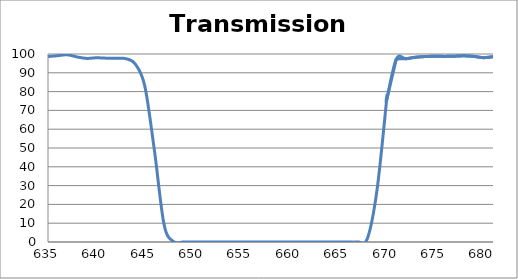
| Category | Transmission (%) |
|---|---|
| 2600.0 | 76.495 |
| 2599.0 | 76.409 |
| 2598.0 | 76.32 |
| 2597.0 | 76.13 |
| 2596.0 | 75.853 |
| 2595.0 | 75.54 |
| 2594.0 | 75.215 |
| 2593.0 | 74.875 |
| 2592.0 | 74.459 |
| 2591.0 | 74.133 |
| 2590.0 | 73.738 |
| 2589.0 | 73.397 |
| 2588.0 | 73.108 |
| 2587.0 | 72.826 |
| 2586.0 | 72.492 |
| 2585.0 | 72.167 |
| 2584.0 | 71.843 |
| 2583.0 | 71.6 |
| 2582.0 | 71.38 |
| 2581.0 | 71.221 |
| 2580.0 | 71.106 |
| 2579.0 | 71.011 |
| 2578.0 | 70.978 |
| 2577.0 | 70.971 |
| 2576.0 | 70.971 |
| 2575.0 | 71.068 |
| 2574.0 | 71.209 |
| 2573.0 | 71.421 |
| 2572.0 | 71.724 |
| 2571.0 | 72.112 |
| 2570.0 | 72.565 |
| 2569.0 | 73.155 |
| 2568.0 | 73.689 |
| 2567.0 | 74.33 |
| 2566.0 | 74.969 |
| 2565.0 | 75.629 |
| 2564.0 | 76.266 |
| 2563.0 | 76.9 |
| 2562.0 | 77.528 |
| 2561.0 | 78.076 |
| 2560.0 | 78.592 |
| 2559.0 | 79.073 |
| 2558.0 | 79.54 |
| 2557.0 | 79.952 |
| 2556.0 | 80.332 |
| 2555.0 | 80.634 |
| 2554.0 | 80.89 |
| 2553.0 | 81.133 |
| 2552.0 | 81.311 |
| 2551.0 | 81.387 |
| 2550.0 | 81.414 |
| 2549.0 | 81.342 |
| 2548.0 | 81.162 |
| 2547.0 | 80.871 |
| 2546.0 | 80.526 |
| 2545.0 | 80.151 |
| 2544.0 | 79.684 |
| 2543.0 | 79.217 |
| 2542.0 | 78.659 |
| 2541.0 | 78.131 |
| 2540.0 | 77.584 |
| 2539.0 | 76.984 |
| 2538.0 | 76.328 |
| 2537.0 | 75.659 |
| 2536.0 | 75.042 |
| 2535.0 | 74.496 |
| 2534.0 | 73.933 |
| 2533.0 | 73.467 |
| 2532.0 | 73.031 |
| 2531.0 | 72.627 |
| 2530.0 | 72.244 |
| 2529.0 | 72.003 |
| 2528.0 | 71.897 |
| 2527.0 | 71.824 |
| 2526.0 | 71.833 |
| 2525.0 | 71.914 |
| 2524.0 | 72.063 |
| 2523.0 | 72.305 |
| 2522.0 | 72.639 |
| 2521.0 | 73.029 |
| 2520.0 | 73.538 |
| 2519.0 | 74.135 |
| 2518.0 | 74.8 |
| 2517.0 | 75.566 |
| 2516.0 | 76.387 |
| 2515.0 | 77.208 |
| 2514.0 | 78.04 |
| 2513.0 | 78.874 |
| 2512.0 | 79.705 |
| 2511.0 | 80.519 |
| 2510.0 | 81.334 |
| 2509.0 | 82.048 |
| 2508.0 | 82.728 |
| 2507.0 | 83.314 |
| 2506.0 | 83.803 |
| 2505.0 | 84.173 |
| 2504.0 | 84.427 |
| 2503.0 | 84.54 |
| 2502.0 | 84.513 |
| 2501.0 | 84.3 |
| 2500.0 | 83.919 |
| 2499.0 | 83.403 |
| 2498.0 | 82.756 |
| 2497.0 | 81.971 |
| 2496.0 | 81.099 |
| 2495.0 | 80.129 |
| 2494.0 | 79.06 |
| 2493.0 | 77.856 |
| 2492.0 | 76.65 |
| 2491.0 | 75.4 |
| 2490.0 | 74.142 |
| 2489.0 | 72.907 |
| 2488.0 | 71.695 |
| 2487.0 | 70.524 |
| 2486.0 | 69.337 |
| 2485.0 | 68.188 |
| 2484.0 | 67.08 |
| 2483.0 | 66.094 |
| 2482.0 | 65.18 |
| 2481.0 | 64.321 |
| 2480.0 | 63.587 |
| 2479.0 | 62.937 |
| 2478.0 | 62.362 |
| 2477.0 | 61.887 |
| 2476.0 | 61.492 |
| 2475.0 | 61.199 |
| 2474.0 | 61.006 |
| 2473.0 | 60.915 |
| 2472.0 | 60.911 |
| 2471.0 | 60.984 |
| 2470.0 | 61.124 |
| 2469.0 | 61.353 |
| 2468.0 | 61.675 |
| 2467.0 | 62.037 |
| 2466.0 | 62.456 |
| 2465.0 | 62.942 |
| 2464.0 | 63.494 |
| 2463.0 | 64.055 |
| 2462.0 | 64.641 |
| 2461.0 | 65.209 |
| 2460.0 | 65.769 |
| 2459.0 | 66.324 |
| 2458.0 | 66.867 |
| 2457.0 | 67.392 |
| 2456.0 | 67.86 |
| 2455.0 | 68.25 |
| 2454.0 | 68.59 |
| 2453.0 | 68.873 |
| 2452.0 | 69.098 |
| 2451.0 | 69.234 |
| 2450.0 | 69.29 |
| 2449.0 | 69.274 |
| 2448.0 | 69.17 |
| 2447.0 | 69.005 |
| 2446.0 | 68.792 |
| 2445.0 | 68.509 |
| 2444.0 | 68.149 |
| 2443.0 | 67.776 |
| 2442.0 | 67.405 |
| 2441.0 | 67.006 |
| 2440.0 | 66.566 |
| 2439.0 | 66.11 |
| 2438.0 | 65.677 |
| 2437.0 | 65.274 |
| 2436.0 | 64.904 |
| 2435.0 | 64.6 |
| 2434.0 | 64.364 |
| 2433.0 | 64.199 |
| 2432.0 | 64.097 |
| 2431.0 | 64.05 |
| 2430.0 | 64.094 |
| 2429.0 | 64.235 |
| 2428.0 | 64.468 |
| 2427.0 | 64.779 |
| 2426.0 | 65.18 |
| 2425.0 | 65.68 |
| 2424.0 | 66.28 |
| 2423.0 | 66.969 |
| 2422.0 | 67.726 |
| 2421.0 | 68.543 |
| 2420.0 | 69.447 |
| 2419.0 | 70.427 |
| 2418.0 | 71.44 |
| 2417.0 | 72.499 |
| 2416.0 | 73.608 |
| 2415.0 | 74.72 |
| 2414.0 | 75.829 |
| 2413.0 | 76.925 |
| 2412.0 | 77.946 |
| 2411.0 | 78.907 |
| 2410.0 | 79.812 |
| 2409.0 | 80.644 |
| 2408.0 | 81.404 |
| 2407.0 | 82.067 |
| 2406.0 | 82.571 |
| 2405.0 | 82.915 |
| 2404.0 | 83.136 |
| 2403.0 | 83.213 |
| 2402.0 | 83.129 |
| 2401.0 | 82.928 |
| 2400.0 | 82.621 |
| 2399.0 | 82.181 |
| 2398.0 | 81.61 |
| 2397.0 | 80.934 |
| 2396.0 | 80.197 |
| 2395.0 | 79.392 |
| 2394.0 | 78.541 |
| 2393.0 | 77.725 |
| 2392.0 | 76.932 |
| 2391.0 | 76.114 |
| 2390.0 | 75.334 |
| 2389.0 | 74.619 |
| 2388.0 | 73.967 |
| 2387.0 | 73.398 |
| 2386.0 | 72.901 |
| 2385.0 | 72.53 |
| 2384.0 | 72.277 |
| 2383.0 | 72.089 |
| 2382.0 | 71.993 |
| 2381.0 | 72.019 |
| 2380.0 | 72.148 |
| 2379.0 | 72.402 |
| 2378.0 | 72.775 |
| 2377.0 | 73.243 |
| 2376.0 | 73.8 |
| 2375.0 | 74.452 |
| 2374.0 | 75.21 |
| 2373.0 | 76.052 |
| 2372.0 | 76.965 |
| 2371.0 | 77.954 |
| 2370.0 | 79.008 |
| 2369.0 | 80.146 |
| 2368.0 | 81.312 |
| 2367.0 | 82.496 |
| 2366.0 | 83.714 |
| 2365.0 | 84.945 |
| 2364.0 | 86.15 |
| 2363.0 | 87.334 |
| 2362.0 | 88.523 |
| 2361.0 | 89.638 |
| 2360.0 | 90.678 |
| 2359.0 | 91.639 |
| 2358.0 | 92.477 |
| 2357.0 | 93.212 |
| 2356.0 | 93.813 |
| 2355.0 | 94.303 |
| 2354.0 | 94.68 |
| 2353.0 | 94.917 |
| 2352.0 | 95.015 |
| 2351.0 | 95.035 |
| 2350.0 | 94.907 |
| 2349.0 | 94.658 |
| 2348.0 | 94.324 |
| 2347.0 | 93.911 |
| 2346.0 | 93.448 |
| 2345.0 | 92.898 |
| 2344.0 | 92.342 |
| 2343.0 | 91.72 |
| 2342.0 | 91.065 |
| 2341.0 | 90.391 |
| 2340.0 | 89.706 |
| 2339.0 | 89.019 |
| 2338.0 | 88.344 |
| 2337.0 | 87.693 |
| 2336.0 | 87.039 |
| 2335.0 | 86.388 |
| 2334.0 | 85.738 |
| 2333.0 | 85.082 |
| 2332.0 | 84.486 |
| 2331.0 | 83.885 |
| 2330.0 | 83.292 |
| 2329.0 | 82.741 |
| 2328.0 | 82.194 |
| 2327.0 | 81.684 |
| 2326.0 | 81.163 |
| 2325.0 | 80.65 |
| 2324.0 | 80.172 |
| 2323.0 | 79.741 |
| 2322.0 | 79.358 |
| 2321.0 | 78.993 |
| 2320.0 | 78.66 |
| 2319.0 | 78.373 |
| 2318.0 | 78.142 |
| 2317.0 | 77.942 |
| 2316.0 | 77.813 |
| 2315.0 | 77.762 |
| 2314.0 | 77.79 |
| 2313.0 | 77.89 |
| 2312.0 | 78.071 |
| 2311.0 | 78.334 |
| 2310.0 | 78.687 |
| 2309.0 | 79.135 |
| 2308.0 | 79.651 |
| 2307.0 | 80.286 |
| 2306.0 | 80.965 |
| 2305.0 | 81.736 |
| 2304.0 | 82.592 |
| 2303.0 | 83.545 |
| 2302.0 | 84.57 |
| 2301.0 | 85.586 |
| 2300.0 | 86.652 |
| 2299.0 | 87.748 |
| 2298.0 | 88.831 |
| 2297.0 | 89.883 |
| 2296.0 | 90.894 |
| 2295.0 | 91.828 |
| 2294.0 | 92.687 |
| 2293.0 | 93.422 |
| 2292.0 | 94.022 |
| 2291.0 | 94.479 |
| 2290.0 | 94.778 |
| 2289.0 | 94.896 |
| 2288.0 | 94.831 |
| 2287.0 | 94.584 |
| 2286.0 | 94.128 |
| 2285.0 | 93.447 |
| 2284.0 | 92.644 |
| 2283.0 | 91.668 |
| 2282.0 | 90.545 |
| 2281.0 | 89.353 |
| 2280.0 | 88.027 |
| 2279.0 | 86.707 |
| 2278.0 | 85.363 |
| 2277.0 | 83.966 |
| 2276.0 | 82.61 |
| 2275.0 | 81.32 |
| 2274.0 | 80.096 |
| 2273.0 | 78.986 |
| 2272.0 | 78.001 |
| 2271.0 | 77.145 |
| 2270.0 | 76.496 |
| 2269.0 | 75.927 |
| 2268.0 | 75.502 |
| 2267.0 | 75.273 |
| 2266.0 | 75.22 |
| 2265.0 | 75.319 |
| 2264.0 | 75.602 |
| 2263.0 | 76.034 |
| 2262.0 | 76.646 |
| 2261.0 | 77.388 |
| 2260.0 | 78.268 |
| 2259.0 | 79.281 |
| 2258.0 | 80.401 |
| 2257.0 | 81.66 |
| 2256.0 | 82.922 |
| 2255.0 | 84.26 |
| 2254.0 | 85.663 |
| 2253.0 | 87.085 |
| 2252.0 | 88.416 |
| 2251.0 | 89.735 |
| 2250.0 | 90.938 |
| 2249.0 | 92.022 |
| 2248.0 | 92.953 |
| 2247.0 | 93.674 |
| 2246.0 | 94.138 |
| 2245.0 | 94.452 |
| 2244.0 | 94.453 |
| 2243.0 | 94.223 |
| 2242.0 | 93.71 |
| 2241.0 | 93.033 |
| 2240.0 | 92.127 |
| 2239.0 | 91.004 |
| 2238.0 | 89.746 |
| 2237.0 | 88.451 |
| 2236.0 | 87.066 |
| 2235.0 | 85.664 |
| 2234.0 | 84.247 |
| 2233.0 | 82.901 |
| 2232.0 | 81.64 |
| 2231.0 | 80.481 |
| 2230.0 | 79.5 |
| 2229.0 | 78.555 |
| 2228.0 | 77.791 |
| 2227.0 | 77.2 |
| 2226.0 | 76.787 |
| 2225.0 | 76.517 |
| 2224.0 | 76.425 |
| 2223.0 | 76.521 |
| 2222.0 | 76.753 |
| 2221.0 | 77.148 |
| 2220.0 | 77.688 |
| 2219.0 | 78.358 |
| 2218.0 | 79.117 |
| 2217.0 | 79.975 |
| 2216.0 | 80.936 |
| 2215.0 | 81.907 |
| 2214.0 | 82.938 |
| 2213.0 | 84.019 |
| 2212.0 | 84.961 |
| 2211.0 | 85.931 |
| 2210.0 | 86.796 |
| 2209.0 | 87.523 |
| 2208.0 | 88.125 |
| 2207.0 | 88.563 |
| 2206.0 | 88.824 |
| 2205.0 | 88.928 |
| 2204.0 | 88.787 |
| 2203.0 | 88.413 |
| 2202.0 | 87.878 |
| 2201.0 | 87.128 |
| 2200.0 | 86.29 |
| 2199.0 | 85.287 |
| 2198.0 | 84.215 |
| 2197.0 | 83.017 |
| 2196.0 | 81.876 |
| 2195.0 | 80.682 |
| 2194.0 | 79.587 |
| 2193.0 | 78.523 |
| 2192.0 | 77.551 |
| 2191.0 | 76.664 |
| 2190.0 | 75.891 |
| 2189.0 | 75.264 |
| 2188.0 | 74.752 |
| 2187.0 | 74.392 |
| 2186.0 | 74.218 |
| 2185.0 | 74.193 |
| 2184.0 | 74.315 |
| 2183.0 | 74.555 |
| 2182.0 | 74.983 |
| 2181.0 | 75.541 |
| 2180.0 | 76.151 |
| 2179.0 | 76.902 |
| 2178.0 | 77.762 |
| 2177.0 | 78.767 |
| 2176.0 | 79.745 |
| 2175.0 | 80.778 |
| 2174.0 | 81.865 |
| 2173.0 | 82.965 |
| 2172.0 | 84.038 |
| 2171.0 | 85.124 |
| 2170.0 | 86.09 |
| 2169.0 | 86.996 |
| 2168.0 | 87.812 |
| 2167.0 | 88.499 |
| 2166.0 | 89.095 |
| 2165.0 | 89.635 |
| 2164.0 | 89.935 |
| 2163.0 | 90.137 |
| 2162.0 | 90.275 |
| 2161.0 | 90.296 |
| 2160.0 | 90.253 |
| 2159.0 | 90.144 |
| 2158.0 | 89.977 |
| 2157.0 | 89.787 |
| 2156.0 | 89.596 |
| 2155.0 | 89.406 |
| 2154.0 | 89.253 |
| 2153.0 | 89.176 |
| 2152.0 | 89.165 |
| 2151.0 | 89.229 |
| 2150.0 | 89.328 |
| 2149.0 | 89.488 |
| 2148.0 | 89.744 |
| 2147.0 | 90.086 |
| 2146.0 | 90.477 |
| 2145.0 | 90.923 |
| 2144.0 | 91.368 |
| 2143.0 | 91.844 |
| 2142.0 | 92.317 |
| 2141.0 | 92.763 |
| 2140.0 | 93.192 |
| 2139.0 | 93.521 |
| 2138.0 | 93.792 |
| 2137.0 | 94 |
| 2136.0 | 94.11 |
| 2135.0 | 94.096 |
| 2134.0 | 93.97 |
| 2133.0 | 93.798 |
| 2132.0 | 93.526 |
| 2131.0 | 93.168 |
| 2130.0 | 92.735 |
| 2129.0 | 92.236 |
| 2128.0 | 91.706 |
| 2127.0 | 91.175 |
| 2126.0 | 90.621 |
| 2125.0 | 90.085 |
| 2124.0 | 89.572 |
| 2123.0 | 89.102 |
| 2122.0 | 88.731 |
| 2121.0 | 88.414 |
| 2120.0 | 88.207 |
| 2119.0 | 88.094 |
| 2118.0 | 88.066 |
| 2117.0 | 88.132 |
| 2116.0 | 88.326 |
| 2115.0 | 88.555 |
| 2114.0 | 88.83 |
| 2113.0 | 89.181 |
| 2112.0 | 89.567 |
| 2111.0 | 89.902 |
| 2110.0 | 90.228 |
| 2109.0 | 90.538 |
| 2108.0 | 90.745 |
| 2107.0 | 90.855 |
| 2106.0 | 90.843 |
| 2105.0 | 90.694 |
| 2104.0 | 90.381 |
| 2103.0 | 89.904 |
| 2102.0 | 89.307 |
| 2101.0 | 88.557 |
| 2100.0 | 87.695 |
| 2099.0 | 86.736 |
| 2098.0 | 85.716 |
| 2097.0 | 84.647 |
| 2096.0 | 83.513 |
| 2095.0 | 82.405 |
| 2094.0 | 81.302 |
| 2093.0 | 80.279 |
| 2092.0 | 79.381 |
| 2091.0 | 78.553 |
| 2090.0 | 77.85 |
| 2089.0 | 77.302 |
| 2088.0 | 76.856 |
| 2087.0 | 76.574 |
| 2086.0 | 76.45 |
| 2085.0 | 76.501 |
| 2084.0 | 76.729 |
| 2083.0 | 77.159 |
| 2082.0 | 77.715 |
| 2081.0 | 78.426 |
| 2080.0 | 79.3 |
| 2079.0 | 80.312 |
| 2078.0 | 81.425 |
| 2077.0 | 82.623 |
| 2076.0 | 83.816 |
| 2075.0 | 85.063 |
| 2074.0 | 86.281 |
| 2073.0 | 87.391 |
| 2072.0 | 88.388 |
| 2071.0 | 89.238 |
| 2070.0 | 89.848 |
| 2069.0 | 90.24 |
| 2068.0 | 90.384 |
| 2067.0 | 90.287 |
| 2066.0 | 89.948 |
| 2065.0 | 89.396 |
| 2064.0 | 88.663 |
| 2063.0 | 87.757 |
| 2062.0 | 86.734 |
| 2061.0 | 85.694 |
| 2060.0 | 84.633 |
| 2059.0 | 83.591 |
| 2058.0 | 82.61 |
| 2057.0 | 81.712 |
| 2056.0 | 80.943 |
| 2055.0 | 80.313 |
| 2054.0 | 79.828 |
| 2053.0 | 79.534 |
| 2052.0 | 79.423 |
| 2051.0 | 79.475 |
| 2050.0 | 79.721 |
| 2049.0 | 80.153 |
| 2048.0 | 80.775 |
| 2047.0 | 81.564 |
| 2046.0 | 82.502 |
| 2045.0 | 83.59 |
| 2044.0 | 84.776 |
| 2043.0 | 86.058 |
| 2042.0 | 87.411 |
| 2041.0 | 88.733 |
| 2040.0 | 89.97 |
| 2039.0 | 91.11 |
| 2038.0 | 92.131 |
| 2037.0 | 93.018 |
| 2036.0 | 93.65 |
| 2035.0 | 94.009 |
| 2034.0 | 94.15 |
| 2033.0 | 94.025 |
| 2032.0 | 93.654 |
| 2031.0 | 93.097 |
| 2030.0 | 92.383 |
| 2029.0 | 91.513 |
| 2028.0 | 90.552 |
| 2027.0 | 89.597 |
| 2026.0 | 88.655 |
| 2025.0 | 87.763 |
| 2024.0 | 86.982 |
| 2023.0 | 86.308 |
| 2022.0 | 85.784 |
| 2021.0 | 85.424 |
| 2020.0 | 85.233 |
| 2019.0 | 85.213 |
| 2018.0 | 85.359 |
| 2017.0 | 85.662 |
| 2016.0 | 86.11 |
| 2015.0 | 86.699 |
| 2014.0 | 87.398 |
| 2013.0 | 88.165 |
| 2012.0 | 89.017 |
| 2011.0 | 89.882 |
| 2010.0 | 90.759 |
| 2009.0 | 91.562 |
| 2008.0 | 92.226 |
| 2007.0 | 92.777 |
| 2006.0 | 93.194 |
| 2005.0 | 93.441 |
| 2004.0 | 93.487 |
| 2003.0 | 93.322 |
| 2002.0 | 92.95 |
| 2001.0 | 92.396 |
| 2000.0 | 91.67 |
| 1999.0 | 90.831 |
| 1998.0 | 89.895 |
| 1997.0 | 88.912 |
| 1996.0 | 87.94 |
| 1995.0 | 86.977 |
| 1994.0 | 86.056 |
| 1993.0 | 85.229 |
| 1992.0 | 84.518 |
| 1991.0 | 83.927 |
| 1990.0 | 83.482 |
| 1989.0 | 83.164 |
| 1988.0 | 82.947 |
| 1987.0 | 82.863 |
| 1986.0 | 82.869 |
| 1985.0 | 82.951 |
| 1984.0 | 83.081 |
| 1983.0 | 83.23 |
| 1982.0 | 83.369 |
| 1981.0 | 83.476 |
| 1980.0 | 83.519 |
| 1979.0 | 83.453 |
| 1978.0 | 83.295 |
| 1977.0 | 83.027 |
| 1976.0 | 82.623 |
| 1975.0 | 82.09 |
| 1974.0 | 81.444 |
| 1973.0 | 80.733 |
| 1972.0 | 79.899 |
| 1971.0 | 79.041 |
| 1970.0 | 78.212 |
| 1969.0 | 77.365 |
| 1968.0 | 76.505 |
| 1967.0 | 75.761 |
| 1966.0 | 75.15 |
| 1965.0 | 74.663 |
| 1964.0 | 74.277 |
| 1963.0 | 74.07 |
| 1962.0 | 74.036 |
| 1961.0 | 74.192 |
| 1960.0 | 74.541 |
| 1959.0 | 75.08 |
| 1958.0 | 75.751 |
| 1957.0 | 76.6 |
| 1956.0 | 77.529 |
| 1955.0 | 78.603 |
| 1954.0 | 79.696 |
| 1953.0 | 80.723 |
| 1952.0 | 81.749 |
| 1951.0 | 82.666 |
| 1950.0 | 83.34 |
| 1949.0 | 83.812 |
| 1948.0 | 84.025 |
| 1947.0 | 83.938 |
| 1946.0 | 83.537 |
| 1945.0 | 82.887 |
| 1944.0 | 81.962 |
| 1943.0 | 80.906 |
| 1942.0 | 79.682 |
| 1941.0 | 78.352 |
| 1940.0 | 76.945 |
| 1939.0 | 75.545 |
| 1938.0 | 74.218 |
| 1937.0 | 73 |
| 1936.0 | 71.998 |
| 1935.0 | 71.189 |
| 1934.0 | 70.548 |
| 1933.0 | 70.138 |
| 1932.0 | 69.931 |
| 1931.0 | 69.978 |
| 1930.0 | 70.23 |
| 1929.0 | 70.734 |
| 1928.0 | 71.495 |
| 1927.0 | 72.473 |
| 1926.0 | 73.657 |
| 1925.0 | 74.984 |
| 1924.0 | 76.434 |
| 1923.0 | 78.027 |
| 1922.0 | 79.839 |
| 1921.0 | 81.772 |
| 1920.0 | 83.596 |
| 1919.0 | 85.242 |
| 1918.0 | 86.724 |
| 1917.0 | 87.857 |
| 1916.0 | 88.733 |
| 1915.0 | 89.407 |
| 1914.0 | 89.894 |
| 1913.0 | 90.047 |
| 1912.0 | 89.941 |
| 1911.0 | 89.673 |
| 1910.0 | 89.291 |
| 1909.0 | 88.844 |
| 1908.0 | 88.32 |
| 1907.0 | 87.74 |
| 1906.0 | 87.143 |
| 1905.0 | 86.649 |
| 1904.0 | 86.308 |
| 1903.0 | 86.096 |
| 1902.0 | 86.074 |
| 1901.0 | 86.184 |
| 1900.0 | 86.462 |
| 1899.0 | 86.794 |
| 1898.0 | 87.159 |
| 1897.0 | 87.694 |
| 1896.0 | 88.136 |
| 1895.0 | 88.514 |
| 1894.0 | 88.987 |
| 1893.0 | 89.339 |
| 1892.0 | 89.641 |
| 1891.0 | 89.814 |
| 1890.0 | 89.771 |
| 1889.0 | 89.626 |
| 1888.0 | 89.479 |
| 1887.0 | 89.218 |
| 1886.0 | 88.857 |
| 1885.0 | 88.413 |
| 1884.0 | 87.944 |
| 1883.0 | 87.486 |
| 1882.0 | 87.097 |
| 1881.0 | 86.799 |
| 1880.0 | 86.659 |
| 1879.0 | 86.623 |
| 1878.0 | 86.676 |
| 1877.0 | 86.872 |
| 1876.0 | 87.179 |
| 1875.0 | 87.482 |
| 1874.0 | 87.815 |
| 1873.0 | 88.038 |
| 1872.0 | 88.232 |
| 1871.0 | 88.268 |
| 1870.0 | 88.078 |
| 1869.0 | 87.587 |
| 1868.0 | 86.813 |
| 1867.0 | 85.785 |
| 1866.0 | 84.556 |
| 1865.0 | 83.071 |
| 1864.0 | 81.392 |
| 1863.0 | 79.567 |
| 1862.0 | 77.652 |
| 1861.0 | 75.404 |
| 1860.0 | 73.223 |
| 1859.0 | 71.191 |
| 1858.0 | 69.442 |
| 1857.0 | 67.973 |
| 1856.0 | 66.793 |
| 1855.0 | 65.82 |
| 1854.0 | 65.071 |
| 1853.0 | 64.631 |
| 1852.0 | 64.461 |
| 1851.0 | 64.608 |
| 1850.0 | 65.147 |
| 1849.0 | 66.042 |
| 1848.0 | 67.405 |
| 1847.0 | 68.913 |
| 1846.0 | 70.651 |
| 1845.0 | 72.109 |
| 1844.0 | 73.716 |
| 1843.0 | 75.611 |
| 1842.0 | 77.558 |
| 1841.0 | 79.414 |
| 1840.0 | 80.747 |
| 1839.0 | 81.598 |
| 1838.0 | 81.907 |
| 1837.0 | 81.738 |
| 1836.0 | 81.013 |
| 1835.0 | 79.793 |
| 1834.0 | 78.367 |
| 1833.0 | 76.814 |
| 1832.0 | 74.901 |
| 1831.0 | 72.905 |
| 1830.0 | 70.749 |
| 1829.0 | 68.926 |
| 1828.0 | 67.428 |
| 1827.0 | 66.107 |
| 1826.0 | 65.027 |
| 1825.0 | 64.442 |
| 1824.0 | 64.145 |
| 1823.0 | 64.229 |
| 1822.0 | 64.631 |
| 1821.0 | 65.223 |
| 1820.0 | 66.083 |
| 1819.0 | 67.132 |
| 1818.0 | 68.396 |
| 1817.0 | 69.867 |
| 1816.0 | 71.561 |
| 1815.0 | 73.088 |
| 1814.0 | 74.538 |
| 1813.0 | 75.849 |
| 1812.0 | 77.04 |
| 1811.0 | 77.987 |
| 1810.0 | 78.672 |
| 1809.0 | 79.099 |
| 1808.0 | 79.175 |
| 1807.0 | 79.024 |
| 1806.0 | 78.694 |
| 1805.0 | 78.214 |
| 1804.0 | 77.708 |
| 1803.0 | 77.193 |
| 1802.0 | 76.814 |
| 1801.0 | 76.522 |
| 1800.0 | 76.404 |
| 1799.0 | 76.496 |
| 1798.0 | 76.794 |
| 1797.0 | 77.358 |
| 1796.0 | 78.024 |
| 1795.0 | 78.911 |
| 1794.0 | 79.887 |
| 1793.0 | 80.865 |
| 1792.0 | 81.864 |
| 1791.0 | 82.765 |
| 1790.0 | 83.44 |
| 1789.0 | 83.906 |
| 1788.0 | 84.078 |
| 1787.0 | 83.954 |
| 1786.0 | 83.558 |
| 1785.0 | 82.955 |
| 1784.0 | 82.15 |
| 1783.0 | 81.247 |
| 1782.0 | 80.333 |
| 1781.0 | 79.504 |
| 1780.0 | 78.73 |
| 1779.0 | 78.173 |
| 1778.0 | 77.832 |
| 1777.0 | 77.734 |
| 1776.0 | 77.883 |
| 1775.0 | 78.287 |
| 1774.0 | 78.881 |
| 1773.0 | 79.664 |
| 1772.0 | 80.567 |
| 1771.0 | 81.505 |
| 1770.0 | 82.394 |
| 1769.0 | 83.16 |
| 1768.0 | 83.601 |
| 1767.0 | 83.706 |
| 1766.0 | 83.365 |
| 1765.0 | 82.587 |
| 1764.0 | 81.334 |
| 1763.0 | 79.706 |
| 1762.0 | 77.747 |
| 1761.0 | 75.583 |
| 1760.0 | 73.273 |
| 1759.0 | 71.066 |
| 1758.0 | 68.944 |
| 1757.0 | 67.117 |
| 1756.0 | 65.524 |
| 1755.0 | 64.257 |
| 1754.0 | 63.43 |
| 1753.0 | 62.951 |
| 1752.0 | 62.824 |
| 1751.0 | 63.046 |
| 1750.0 | 63.58 |
| 1749.0 | 64.365 |
| 1748.0 | 65.343 |
| 1747.0 | 66.401 |
| 1746.0 | 67.45 |
| 1745.0 | 68.338 |
| 1744.0 | 68.964 |
| 1743.0 | 69.221 |
| 1742.0 | 69.033 |
| 1741.0 | 68.404 |
| 1740.0 | 67.297 |
| 1739.0 | 65.809 |
| 1738.0 | 64.118 |
| 1737.0 | 62.233 |
| 1736.0 | 60.28 |
| 1735.0 | 58.38 |
| 1734.0 | 56.611 |
| 1733.0 | 55.109 |
| 1732.0 | 53.83 |
| 1731.0 | 52.853 |
| 1730.0 | 52.181 |
| 1729.0 | 51.835 |
| 1728.0 | 51.809 |
| 1727.0 | 52.088 |
| 1726.0 | 52.636 |
| 1725.0 | 53.376 |
| 1724.0 | 54.281 |
| 1723.0 | 55.257 |
| 1722.0 | 56.195 |
| 1721.0 | 56.988 |
| 1720.0 | 57.5 |
| 1719.0 | 57.651 |
| 1718.0 | 57.362 |
| 1717.0 | 56.635 |
| 1716.0 | 55.496 |
| 1715.0 | 53.99 |
| 1714.0 | 52.255 |
| 1713.0 | 50.433 |
| 1712.0 | 48.649 |
| 1711.0 | 47.076 |
| 1710.0 | 45.647 |
| 1709.0 | 44.482 |
| 1708.0 | 43.652 |
| 1707.0 | 43.166 |
| 1706.0 | 43.03 |
| 1705.0 | 43.262 |
| 1704.0 | 43.891 |
| 1703.0 | 44.897 |
| 1702.0 | 46.259 |
| 1701.0 | 48.023 |
| 1700.0 | 50.055 |
| 1699.0 | 52.169 |
| 1698.0 | 54.458 |
| 1697.0 | 56.638 |
| 1696.0 | 58.636 |
| 1695.0 | 60.298 |
| 1694.0 | 61.431 |
| 1693.0 | 61.987 |
| 1692.0 | 61.936 |
| 1691.0 | 61.31 |
| 1690.0 | 60.193 |
| 1689.0 | 58.742 |
| 1688.0 | 57.153 |
| 1687.0 | 55.607 |
| 1686.0 | 54.131 |
| 1685.0 | 52.92 |
| 1684.0 | 52.008 |
| 1683.0 | 51.465 |
| 1682.0 | 51.334 |
| 1681.0 | 51.635 |
| 1680.0 | 52.357 |
| 1679.0 | 53.498 |
| 1678.0 | 55.051 |
| 1677.0 | 56.928 |
| 1676.0 | 59.07 |
| 1675.0 | 61.403 |
| 1674.0 | 63.668 |
| 1673.0 | 65.731 |
| 1672.0 | 67.467 |
| 1671.0 | 68.683 |
| 1670.0 | 69.357 |
| 1669.0 | 69.48 |
| 1668.0 | 69.107 |
| 1667.0 | 68.291 |
| 1666.0 | 67.224 |
| 1665.0 | 66.112 |
| 1664.0 | 65.077 |
| 1663.0 | 64.241 |
| 1662.0 | 63.702 |
| 1661.0 | 63.519 |
| 1660.0 | 63.688 |
| 1659.0 | 64.209 |
| 1658.0 | 65.097 |
| 1657.0 | 66.276 |
| 1656.0 | 67.678 |
| 1655.0 | 69.231 |
| 1654.0 | 70.775 |
| 1653.0 | 72.175 |
| 1652.0 | 73.321 |
| 1651.0 | 74.085 |
| 1650.0 | 74.41 |
| 1649.0 | 74.275 |
| 1648.0 | 73.699 |
| 1647.0 | 72.737 |
| 1646.0 | 71.518 |
| 1645.0 | 70.207 |
| 1644.0 | 68.937 |
| 1643.0 | 67.807 |
| 1642.0 | 66.957 |
| 1641.0 | 66.461 |
| 1640.0 | 66.325 |
| 1639.0 | 66.598 |
| 1638.0 | 67.262 |
| 1637.0 | 68.3 |
| 1636.0 | 69.551 |
| 1635.0 | 70.885 |
| 1634.0 | 72.172 |
| 1633.0 | 73.247 |
| 1632.0 | 73.934 |
| 1631.0 | 74.059 |
| 1630.0 | 73.557 |
| 1629.0 | 72.434 |
| 1628.0 | 70.847 |
| 1627.0 | 68.886 |
| 1626.0 | 66.711 |
| 1625.0 | 64.474 |
| 1624.0 | 62.37 |
| 1623.0 | 60.604 |
| 1622.0 | 59.176 |
| 1621.0 | 58.175 |
| 1620.0 | 57.614 |
| 1619.0 | 57.466 |
| 1618.0 | 57.746 |
| 1617.0 | 58.438 |
| 1616.0 | 59.502 |
| 1615.0 | 60.854 |
| 1614.0 | 62.401 |
| 1613.0 | 64.052 |
| 1612.0 | 65.68 |
| 1611.0 | 67.096 |
| 1610.0 | 68.208 |
| 1609.0 | 68.909 |
| 1608.0 | 69.117 |
| 1607.0 | 68.842 |
| 1606.0 | 68.158 |
| 1605.0 | 67.14 |
| 1604.0 | 65.931 |
| 1603.0 | 64.668 |
| 1602.0 | 63.495 |
| 1601.0 | 62.517 |
| 1600.0 | 61.806 |
| 1599.0 | 61.422 |
| 1598.0 | 61.411 |
| 1597.0 | 61.78 |
| 1596.0 | 62.498 |
| 1595.0 | 63.512 |
| 1594.0 | 64.741 |
| 1593.0 | 66.235 |
| 1592.0 | 67.71 |
| 1591.0 | 69.125 |
| 1590.0 | 70.462 |
| 1589.0 | 71.57 |
| 1588.0 | 72.417 |
| 1587.0 | 73.035 |
| 1586.0 | 73.422 |
| 1585.0 | 73.619 |
| 1584.0 | 73.691 |
| 1583.0 | 73.692 |
| 1582.0 | 73.713 |
| 1581.0 | 73.762 |
| 1580.0 | 73.863 |
| 1579.0 | 74.007 |
| 1578.0 | 74.181 |
| 1577.0 | 74.324 |
| 1576.0 | 74.393 |
| 1575.0 | 74.366 |
| 1574.0 | 74.173 |
| 1573.0 | 73.784 |
| 1572.0 | 73.207 |
| 1571.0 | 72.492 |
| 1570.0 | 71.644 |
| 1569.0 | 70.734 |
| 1568.0 | 69.892 |
| 1567.0 | 69.136 |
| 1566.0 | 68.522 |
| 1565.0 | 68.143 |
| 1564.0 | 68.016 |
| 1563.0 | 68.132 |
| 1562.0 | 68.476 |
| 1561.0 | 68.989 |
| 1560.0 | 69.568 |
| 1559.0 | 70.127 |
| 1558.0 | 70.535 |
| 1557.0 | 70.637 |
| 1556.0 | 70.383 |
| 1555.0 | 69.679 |
| 1554.0 | 68.578 |
| 1553.0 | 67.065 |
| 1552.0 | 65.359 |
| 1551.0 | 63.528 |
| 1550.0 | 61.771 |
| 1549.0 | 60.172 |
| 1548.0 | 58.941 |
| 1547.0 | 58.044 |
| 1546.0 | 57.547 |
| 1545.0 | 57.484 |
| 1544.0 | 57.809 |
| 1543.0 | 58.532 |
| 1542.0 | 59.524 |
| 1541.0 | 60.732 |
| 1540.0 | 61.997 |
| 1539.0 | 63.201 |
| 1538.0 | 64.172 |
| 1537.0 | 64.729 |
| 1536.0 | 64.815 |
| 1535.0 | 64.442 |
| 1534.0 | 63.601 |
| 1533.0 | 62.395 |
| 1532.0 | 61.022 |
| 1531.0 | 59.615 |
| 1530.0 | 58.31 |
| 1529.0 | 57.187 |
| 1528.0 | 56.419 |
| 1527.0 | 55.995 |
| 1526.0 | 56.064 |
| 1525.0 | 56.577 |
| 1524.0 | 57.538 |
| 1523.0 | 58.91 |
| 1522.0 | 60.631 |
| 1521.0 | 62.568 |
| 1520.0 | 64.541 |
| 1519.0 | 66.474 |
| 1518.0 | 68.178 |
| 1517.0 | 69.369 |
| 1516.0 | 70.086 |
| 1515.0 | 70.316 |
| 1514.0 | 70.124 |
| 1513.0 | 69.567 |
| 1512.0 | 68.881 |
| 1511.0 | 68.262 |
| 1510.0 | 67.72 |
| 1509.0 | 67.408 |
| 1508.0 | 67.358 |
| 1507.0 | 67.555 |
| 1506.0 | 67.91 |
| 1505.0 | 68.361 |
| 1504.0 | 68.857 |
| 1503.0 | 69.241 |
| 1502.0 | 69.436 |
| 1501.0 | 69.396 |
| 1500.0 | 69.108 |
| 1499.0 | 68.589 |
| 1498.0 | 67.887 |
| 1497.0 | 67.094 |
| 1496.0 | 66.425 |
| 1495.0 | 65.84 |
| 1494.0 | 65.432 |
| 1493.0 | 65.266 |
| 1492.0 | 65.345 |
| 1491.0 | 65.663 |
| 1490.0 | 66.107 |
| 1489.0 | 66.632 |
| 1488.0 | 67.097 |
| 1487.0 | 67.394 |
| 1486.0 | 67.41 |
| 1485.0 | 67.075 |
| 1484.0 | 66.318 |
| 1483.0 | 65.256 |
| 1482.0 | 63.954 |
| 1481.0 | 62.545 |
| 1480.0 | 61.199 |
| 1479.0 | 59.974 |
| 1478.0 | 59.067 |
| 1477.0 | 58.42 |
| 1476.0 | 58.096 |
| 1475.0 | 58.069 |
| 1474.0 | 58.266 |
| 1473.0 | 58.527 |
| 1472.0 | 58.739 |
| 1471.0 | 58.721 |
| 1470.0 | 58.35 |
| 1469.0 | 57.613 |
| 1468.0 | 56.493 |
| 1467.0 | 54.99 |
| 1466.0 | 53.47 |
| 1465.0 | 51.902 |
| 1464.0 | 50.432 |
| 1463.0 | 49.232 |
| 1462.0 | 48.382 |
| 1461.0 | 47.901 |
| 1460.0 | 47.878 |
| 1459.0 | 48.218 |
| 1458.0 | 48.838 |
| 1457.0 | 49.724 |
| 1456.0 | 50.679 |
| 1455.0 | 51.656 |
| 1454.0 | 52.285 |
| 1453.0 | 52.564 |
| 1452.0 | 52.406 |
| 1451.0 | 51.782 |
| 1450.0 | 50.708 |
| 1449.0 | 49.416 |
| 1448.0 | 48.047 |
| 1447.0 | 46.809 |
| 1446.0 | 45.916 |
| 1445.0 | 45.335 |
| 1444.0 | 45.2 |
| 1443.0 | 45.58 |
| 1442.0 | 46.517 |
| 1441.0 | 47.986 |
| 1440.0 | 49.786 |
| 1439.0 | 51.917 |
| 1438.0 | 54.002 |
| 1437.0 | 55.794 |
| 1436.0 | 57.079 |
| 1435.0 | 57.663 |
| 1434.0 | 57.447 |
| 1433.0 | 56.573 |
| 1432.0 | 55.318 |
| 1431.0 | 53.951 |
| 1430.0 | 52.765 |
| 1429.0 | 51.955 |
| 1428.0 | 51.665 |
| 1427.0 | 51.987 |
| 1426.0 | 52.868 |
| 1425.0 | 54.39 |
| 1424.0 | 56.409 |
| 1423.0 | 58.686 |
| 1422.0 | 60.925 |
| 1421.0 | 62.923 |
| 1420.0 | 64.471 |
| 1419.0 | 65.249 |
| 1418.0 | 65.13 |
| 1417.0 | 64.341 |
| 1416.0 | 63.18 |
| 1415.0 | 61.764 |
| 1414.0 | 60.211 |
| 1413.0 | 58.812 |
| 1412.0 | 57.91 |
| 1411.0 | 57.307 |
| 1410.0 | 57.122 |
| 1409.0 | 57.105 |
| 1408.0 | 57.12 |
| 1407.0 | 57.199 |
| 1406.0 | 57.295 |
| 1405.0 | 57.21 |
| 1404.0 | 56.903 |
| 1403.0 | 56.403 |
| 1402.0 | 55.976 |
| 1401.0 | 55.588 |
| 1400.0 | 54.997 |
| 1399.0 | 54.467 |
| 1398.0 | 54.303 |
| 1397.0 | 54.416 |
| 1396.0 | 54.651 |
| 1395.0 | 54.432 |
| 1394.0 | 53.9 |
| 1393.0 | 52.954 |
| 1392.0 | 51.459 |
| 1391.0 | 49.639 |
| 1390.0 | 47.652 |
| 1389.0 | 45.547 |
| 1388.0 | 43.403 |
| 1387.0 | 41.5 |
| 1386.0 | 40.213 |
| 1385.0 | 39.583 |
| 1384.0 | 39.525 |
| 1383.0 | 40.06 |
| 1382.0 | 41.145 |
| 1381.0 | 42.813 |
| 1380.0 | 44.855 |
| 1379.0 | 47.317 |
| 1378.0 | 49.476 |
| 1377.0 | 51.467 |
| 1376.0 | 52.778 |
| 1375.0 | 53.309 |
| 1374.0 | 53.084 |
| 1373.0 | 52.315 |
| 1372.0 | 51.292 |
| 1371.0 | 50.215 |
| 1370.0 | 49.406 |
| 1369.0 | 49.173 |
| 1368.0 | 49.655 |
| 1367.0 | 50.701 |
| 1366.0 | 52.217 |
| 1365.0 | 54.482 |
| 1364.0 | 56.929 |
| 1363.0 | 59.068 |
| 1362.0 | 60.999 |
| 1361.0 | 62.153 |
| 1360.0 | 62.372 |
| 1359.0 | 61.796 |
| 1358.0 | 60.844 |
| 1357.0 | 60.002 |
| 1356.0 | 59.319 |
| 1355.0 | 58.98 |
| 1354.0 | 59.003 |
| 1353.0 | 59.413 |
| 1352.0 | 59.985 |
| 1351.0 | 60.316 |
| 1350.0 | 59.958 |
| 1349.0 | 58.679 |
| 1348.0 | 56.444 |
| 1347.0 | 53.459 |
| 1346.0 | 50.055 |
| 1345.0 | 46.678 |
| 1344.0 | 43.797 |
| 1343.0 | 41.417 |
| 1342.0 | 39.79 |
| 1341.0 | 38.77 |
| 1340.0 | 38.256 |
| 1339.0 | 38.192 |
| 1338.0 | 38.462 |
| 1337.0 | 38.899 |
| 1336.0 | 39.233 |
| 1335.0 | 39.364 |
| 1334.0 | 39.214 |
| 1333.0 | 38.775 |
| 1332.0 | 38.125 |
| 1331.0 | 37.401 |
| 1330.0 | 36.745 |
| 1329.0 | 36.307 |
| 1328.0 | 36.159 |
| 1327.0 | 36.295 |
| 1326.0 | 36.639 |
| 1325.0 | 37.057 |
| 1324.0 | 37.318 |
| 1323.0 | 37.212 |
| 1322.0 | 36.563 |
| 1321.0 | 35.356 |
| 1320.0 | 33.769 |
| 1319.0 | 32.004 |
| 1318.0 | 30.4 |
| 1317.0 | 29.177 |
| 1316.0 | 28.488 |
| 1315.0 | 28.451 |
| 1314.0 | 29.142 |
| 1313.0 | 30.588 |
| 1312.0 | 32.756 |
| 1311.0 | 35.621 |
| 1310.0 | 38.76 |
| 1309.0 | 41.444 |
| 1308.0 | 43.246 |
| 1307.0 | 43.643 |
| 1306.0 | 42.592 |
| 1305.0 | 40.591 |
| 1304.0 | 38.386 |
| 1303.0 | 36.532 |
| 1302.0 | 35.387 |
| 1301.0 | 35.188 |
| 1300.0 | 35.967 |
| 1299.0 | 37.836 |
| 1298.0 | 40.792 |
| 1297.0 | 44.713 |
| 1296.0 | 49.14 |
| 1295.0 | 53.262 |
| 1294.0 | 56.186 |
| 1293.0 | 57.298 |
| 1292.0 | 56.457 |
| 1291.0 | 54.317 |
| 1290.0 | 51.787 |
| 1289.0 | 49.692 |
| 1288.0 | 48.55 |
| 1287.0 | 48.631 |
| 1286.0 | 49.977 |
| 1285.0 | 52.453 |
| 1284.0 | 55.593 |
| 1283.0 | 58.595 |
| 1282.0 | 60.438 |
| 1281.0 | 60.289 |
| 1280.0 | 58.138 |
| 1279.0 | 54.658 |
| 1278.0 | 50.95 |
| 1277.0 | 47.844 |
| 1276.0 | 45.818 |
| 1275.0 | 45.113 |
| 1274.0 | 45.747 |
| 1273.0 | 47.495 |
| 1272.0 | 49.853 |
| 1271.0 | 52.076 |
| 1270.0 | 53.201 |
| 1269.0 | 52.558 |
| 1268.0 | 50.063 |
| 1267.0 | 46.356 |
| 1266.0 | 42.404 |
| 1265.0 | 39.059 |
| 1264.0 | 36.74 |
| 1263.0 | 35.427 |
| 1262.0 | 35.152 |
| 1261.0 | 35.844 |
| 1260.0 | 37.295 |
| 1259.0 | 39.182 |
| 1258.0 | 41.028 |
| 1257.0 | 42.314 |
| 1256.0 | 42.697 |
| 1255.0 | 42.075 |
| 1254.0 | 40.681 |
| 1253.0 | 39.107 |
| 1252.0 | 37.846 |
| 1251.0 | 37.146 |
| 1250.0 | 37.257 |
| 1249.0 | 38.262 |
| 1248.0 | 40.209 |
| 1247.0 | 42.852 |
| 1246.0 | 45.764 |
| 1245.0 | 48.413 |
| 1244.0 | 50.163 |
| 1243.0 | 50.701 |
| 1242.0 | 50.174 |
| 1241.0 | 49.069 |
| 1240.0 | 48.062 |
| 1239.0 | 47.646 |
| 1238.0 | 47.996 |
| 1237.0 | 49.031 |
| 1236.0 | 50.397 |
| 1235.0 | 51.489 |
| 1234.0 | 51.706 |
| 1233.0 | 50.713 |
| 1232.0 | 48.698 |
| 1231.0 | 46.219 |
| 1230.0 | 43.889 |
| 1229.0 | 42.248 |
| 1228.0 | 41.626 |
| 1227.0 | 41.985 |
| 1226.0 | 43.075 |
| 1225.0 | 44.381 |
| 1224.0 | 45.191 |
| 1223.0 | 44.846 |
| 1222.0 | 42.987 |
| 1221.0 | 40.121 |
| 1220.0 | 36.828 |
| 1219.0 | 33.732 |
| 1218.0 | 31.425 |
| 1217.0 | 30.096 |
| 1216.0 | 29.849 |
| 1215.0 | 30.592 |
| 1214.0 | 32.136 |
| 1213.0 | 34.082 |
| 1212.0 | 35.811 |
| 1211.0 | 36.624 |
| 1210.0 | 36 |
| 1209.0 | 34.052 |
| 1208.0 | 31.355 |
| 1207.0 | 28.648 |
| 1206.0 | 26.657 |
| 1205.0 | 25.602 |
| 1204.0 | 25.574 |
| 1203.0 | 26.677 |
| 1202.0 | 28.782 |
| 1201.0 | 31.661 |
| 1200.0 | 34.913 |
| 1199.0 | 37.334 |
| 1198.0 | 38.14 |
| 1197.0 | 37.242 |
| 1196.0 | 35.227 |
| 1195.0 | 33.135 |
| 1194.0 | 31.72 |
| 1193.0 | 31.483 |
| 1192.0 | 32.679 |
| 1191.0 | 35.595 |
| 1190.0 | 39.72 |
| 1189.0 | 44.72 |
| 1188.0 | 48.88 |
| 1187.0 | 50.852 |
| 1186.0 | 50.23 |
| 1185.0 | 47.764 |
| 1184.0 | 44.851 |
| 1183.0 | 42.634 |
| 1182.0 | 41.803 |
| 1181.0 | 42.551 |
| 1180.0 | 44.77 |
| 1179.0 | 47.895 |
| 1178.0 | 50.973 |
| 1177.0 | 52.726 |
| 1176.0 | 52.331 |
| 1175.0 | 50.064 |
| 1174.0 | 46.714 |
| 1173.0 | 43.554 |
| 1172.0 | 41.286 |
| 1171.0 | 40.153 |
| 1170.0 | 40.09 |
| 1169.0 | 40.649 |
| 1168.0 | 41.111 |
| 1167.0 | 40.709 |
| 1166.0 | 38.848 |
| 1165.0 | 35.788 |
| 1164.0 | 32.261 |
| 1163.0 | 28.992 |
| 1162.0 | 26.413 |
| 1161.0 | 24.75 |
| 1160.0 | 23.935 |
| 1159.0 | 23.814 |
| 1158.0 | 24.166 |
| 1157.0 | 24.682 |
| 1156.0 | 25.053 |
| 1155.0 | 25.019 |
| 1154.0 | 24.609 |
| 1153.0 | 24.008 |
| 1152.0 | 23.449 |
| 1151.0 | 23.212 |
| 1150.0 | 23.463 |
| 1149.0 | 24.209 |
| 1148.0 | 25.382 |
| 1147.0 | 26.773 |
| 1146.0 | 27.944 |
| 1145.0 | 28.741 |
| 1144.0 | 28.991 |
| 1143.0 | 28.814 |
| 1142.0 | 28.528 |
| 1141.0 | 28.473 |
| 1140.0 | 28.911 |
| 1139.0 | 29.975 |
| 1138.0 | 31.652 |
| 1137.0 | 33.87 |
| 1136.0 | 36.458 |
| 1135.0 | 38.741 |
| 1134.0 | 40.551 |
| 1133.0 | 41.712 |
| 1132.0 | 42.569 |
| 1131.0 | 43.453 |
| 1130.0 | 44.671 |
| 1129.0 | 46.57 |
| 1128.0 | 49.324 |
| 1127.0 | 52.762 |
| 1126.0 | 56.28 |
| 1125.0 | 59.763 |
| 1124.0 | 62.549 |
| 1123.0 | 64.321 |
| 1122.0 | 65.5 |
| 1121.0 | 66.168 |
| 1120.0 | 66.443 |
| 1119.0 | 66.163 |
| 1118.0 | 65.146 |
| 1117.0 | 63.225 |
| 1116.0 | 60.754 |
| 1115.0 | 58.286 |
| 1114.0 | 56.396 |
| 1113.0 | 55.497 |
| 1112.0 | 55.581 |
| 1111.0 | 56.291 |
| 1110.0 | 56.831 |
| 1109.0 | 56.277 |
| 1108.0 | 54.113 |
| 1107.0 | 50.628 |
| 1106.0 | 46.657 |
| 1105.0 | 43.088 |
| 1104.0 | 40.689 |
| 1103.0 | 39.685 |
| 1102.0 | 40.135 |
| 1101.0 | 41.944 |
| 1100.0 | 44.594 |
| 1099.0 | 47.631 |
| 1098.0 | 50.143 |
| 1097.0 | 51.623 |
| 1096.0 | 51.921 |
| 1095.0 | 51.429 |
| 1094.0 | 50.79 |
| 1093.0 | 50.662 |
| 1092.0 | 51.299 |
| 1091.0 | 52.614 |
| 1090.0 | 54.259 |
| 1089.0 | 55.731 |
| 1088.0 | 56.583 |
| 1087.0 | 56.742 |
| 1086.0 | 56.578 |
| 1085.0 | 56.579 |
| 1084.0 | 57.223 |
| 1083.0 | 58.54 |
| 1082.0 | 60.338 |
| 1081.0 | 61.801 |
| 1080.0 | 62.538 |
| 1079.0 | 62.151 |
| 1078.0 | 60.867 |
| 1077.0 | 59.295 |
| 1076.0 | 58.065 |
| 1075.0 | 57.51 |
| 1074.0 | 57.565 |
| 1073.0 | 57.793 |
| 1072.0 | 57.751 |
| 1071.0 | 57.157 |
| 1070.0 | 56.142 |
| 1069.0 | 55.134 |
| 1068.0 | 54.511 |
| 1067.0 | 54.564 |
| 1066.0 | 55.27 |
| 1065.0 | 56.293 |
| 1064.0 | 57.132 |
| 1063.0 | 57.432 |
| 1062.0 | 57.09 |
| 1061.0 | 56.471 |
| 1060.0 | 56.03 |
| 1059.0 | 56.184 |
| 1058.0 | 57.06 |
| 1057.0 | 58.504 |
| 1056.0 | 60.145 |
| 1055.0 | 61.376 |
| 1054.0 | 61.93 |
| 1053.0 | 61.859 |
| 1052.0 | 61.521 |
| 1051.0 | 61.427 |
| 1050.0 | 62.087 |
| 1049.0 | 63.455 |
| 1048.0 | 65.308 |
| 1047.0 | 66.994 |
| 1046.0 | 68.111 |
| 1045.0 | 68.368 |
| 1044.0 | 68.145 |
| 1043.0 | 67.918 |
| 1042.0 | 68.101 |
| 1041.0 | 68.677 |
| 1040.0 | 69.27 |
| 1039.0 | 69.257 |
| 1038.0 | 68.364 |
| 1037.0 | 66.778 |
| 1036.0 | 65.148 |
| 1035.0 | 64.126 |
| 1034.0 | 64.067 |
| 1033.0 | 64.737 |
| 1032.0 | 65.576 |
| 1031.0 | 65.947 |
| 1030.0 | 65.376 |
| 1029.0 | 64.098 |
| 1028.0 | 62.697 |
| 1027.0 | 61.89 |
| 1026.0 | 62.22 |
| 1025.0 | 63.436 |
| 1024.0 | 64.919 |
| 1023.0 | 65.995 |
| 1022.0 | 66.136 |
| 1021.0 | 65.521 |
| 1020.0 | 64.713 |
| 1019.0 | 64.45 |
| 1018.0 | 65.157 |
| 1017.0 | 66.915 |
| 1016.0 | 69.116 |
| 1015.0 | 71.181 |
| 1014.0 | 72.452 |
| 1013.0 | 72.72 |
| 1012.0 | 72.345 |
| 1011.0 | 72.057 |
| 1010.0 | 72.151 |
| 1009.0 | 72.66 |
| 1008.0 | 73.164 |
| 1007.0 | 73.13 |
| 1006.0 | 72.353 |
| 1005.0 | 71.147 |
| 1004.0 | 70.065 |
| 1003.0 | 69.658 |
| 1002.0 | 70.067 |
| 1001.0 | 70.995 |
| 1000.0 | 71.861 |
| 999.0 | 72.226 |
| 998.0 | 72.143 |
| 997.0 | 72.013 |
| 996.0 | 72.288 |
| 995.0 | 73.061 |
| 994.0 | 73.99 |
| 993.0 | 74.437 |
| 992.0 | 74.033 |
| 991.0 | 72.862 |
| 990.0 | 71.85 |
| 989.0 | 71.558 |
| 988.0 | 72.29 |
| 987.0 | 73.651 |
| 986.0 | 74.774 |
| 985.0 | 74.996 |
| 984.0 | 74.217 |
| 983.0 | 73.134 |
| 982.0 | 72.476 |
| 981.0 | 72.779 |
| 980.0 | 73.937 |
| 979.0 | 75.166 |
| 978.0 | 75.771 |
| 977.0 | 75.28 |
| 976.0 | 74.072 |
| 975.0 | 72.983 |
| 974.0 | 72.648 |
| 973.0 | 73.284 |
| 972.0 | 74.335 |
| 971.0 | 74.995 |
| 970.0 | 74.654 |
| 969.0 | 73.388 |
| 968.0 | 72.1 |
| 967.0 | 71.67 |
| 966.0 | 72.25 |
| 965.0 | 73.4 |
| 964.0 | 74.06 |
| 963.0 | 73.418 |
| 962.0 | 71.636 |
| 961.0 | 69.791 |
| 960.0 | 68.941 |
| 959.0 | 69.629 |
| 958.0 | 71.283 |
| 957.0 | 72.585 |
| 956.0 | 72.572 |
| 955.0 | 71.243 |
| 954.0 | 69.446 |
| 953.0 | 68.612 |
| 952.0 | 69.248 |
| 951.0 | 70.964 |
| 950.0 | 72.559 |
| 949.0 | 72.821 |
| 948.0 | 71.764 |
| 947.0 | 70.369 |
| 946.0 | 69.889 |
| 945.0 | 70.964 |
| 944.0 | 73.22 |
| 943.0 | 75.301 |
| 942.0 | 76.109 |
| 941.0 | 75.338 |
| 940.0 | 73.712 |
| 939.0 | 72.743 |
| 938.0 | 73.366 |
| 937.0 | 75.689 |
| 936.0 | 78.755 |
| 935.0 | 81.188 |
| 934.0 | 81.871 |
| 933.0 | 81.005 |
| 932.0 | 79.528 |
| 931.0 | 78.654 |
| 930.0 | 79.051 |
| 929.0 | 80.7 |
| 928.0 | 82.83 |
| 927.0 | 84.587 |
| 926.0 | 85.405 |
| 925.0 | 85.554 |
| 924.0 | 85.557 |
| 923.0 | 85.935 |
| 922.0 | 86.902 |
| 921.0 | 88.203 |
| 920.0 | 89.482 |
| 919.0 | 90.462 |
| 918.0 | 91.124 |
| 917.0 | 91.471 |
| 916.0 | 91.702 |
| 915.0 | 91.903 |
| 914.0 | 92.051 |
| 913.0 | 92.185 |
| 912.0 | 92.314 |
| 911.0 | 92.444 |
| 910.0 | 92.569 |
| 909.0 | 92.725 |
| 908.0 | 92.888 |
| 907.0 | 93.031 |
| 906.0 | 93.152 |
| 905.0 | 93.251 |
| 904.0 | 93.35 |
| 903.0 | 93.442 |
| 902.0 | 93.555 |
| 901.0 | 93.675 |
| 900.0 | 93.656 |
| 899.0 | 98.203 |
| 898.0 | 99.117 |
| 897.0 | 97.066 |
| 896.0 | 92.777 |
| 895.0 | 92.704 |
| 894.0 | 93.212 |
| 893.0 | 94.525 |
| 892.0 | 94.033 |
| 891.0 | 94.437 |
| 890.0 | 95.159 |
| 889.0 | 96.382 |
| 888.0 | 96.509 |
| 887.0 | 92.597 |
| 886.0 | 94.352 |
| 885.0 | 96.778 |
| 884.0 | 96.762 |
| 883.0 | 96.547 |
| 882.0 | 94.212 |
| 881.0 | 94.523 |
| 880.0 | 93.441 |
| 879.0 | 95.342 |
| 878.0 | 98.89 |
| 877.0 | 99.956 |
| 876.0 | 96.834 |
| 875.0 | 92.437 |
| 874.0 | 92.045 |
| 873.0 | 94.237 |
| 872.0 | 98.142 |
| 871.0 | 97.896 |
| 870.0 | 98.105 |
| 869.0 | 98.036 |
| 868.0 | 93.631 |
| 867.0 | 93.866 |
| 866.0 | 94.116 |
| 865.0 | 94.399 |
| 864.0 | 98.565 |
| 863.0 | 98.768 |
| 862.0 | 96.659 |
| 861.0 | 94.247 |
| 860.0 | 97.251 |
| 859.0 | 96.907 |
| 858.0 | 94.85 |
| 857.0 | 92.753 |
| 856.0 | 93.13 |
| 855.0 | 91.019 |
| 854.0 | 94.465 |
| 853.0 | 94.972 |
| 852.0 | 97.245 |
| 851.0 | 94.42 |
| 850.0 | 90.823 |
| 849.0 | 96.787 |
| 848.0 | 99.626 |
| 847.0 | 98.748 |
| 846.0 | 97.53 |
| 845.0 | 97.505 |
| 844.0 | 94.494 |
| 843.0 | 96.245 |
| 842.0 | 97.584 |
| 841.0 | 99.104 |
| 840.0 | 98.915 |
| 839.0 | 95.371 |
| 838.0 | 95.318 |
| 837.0 | 99.565 |
| 836.0 | 96.822 |
| 835.0 | 98.139 |
| 834.0 | 99.278 |
| 833.0 | 97.526 |
| 832.0 | 97.92 |
| 831.0 | 99.596 |
| 830.0 | 97.935 |
| 829.0 | 99.618 |
| 828.0 | 96.617 |
| 827.0 | 98.059 |
| 826.0 | 97.039 |
| 825.0 | 98.696 |
| 824.0 | 99.137 |
| 823.0 | 99.165 |
| 822.0 | 96.834 |
| 821.0 | 98.426 |
| 820.0 | 99.595 |
| 819.0 | 99.866 |
| 818.0 | 99.704 |
| 817.0 | 98.967 |
| 816.0 | 98.774 |
| 815.0 | 99.495 |
| 814.0 | 98.23 |
| 813.0 | 98.436 |
| 812.0 | 99.884 |
| 811.0 | 98.899 |
| 810.0 | 98.035 |
| 809.0 | 98.419 |
| 808.0 | 99.581 |
| 807.0 | 99.221 |
| 806.0 | 98.951 |
| 805.0 | 99.795 |
| 804.0 | 98.674 |
| 803.0 | 99.295 |
| 802.0 | 99.614 |
| 801.0 | 99.412 |
| 800.0 | 99.544 |
| 799.0 | 98.839 |
| 798.0 | 100 |
| 797.0 | 99.921 |
| 796.0 | 99.894 |
| 795.0 | 99.293 |
| 794.0 | 99.088 |
| 793.0 | 98.824 |
| 792.0 | 99.386 |
| 791.0 | 99.655 |
| 790.0 | 98.325 |
| 789.0 | 99.033 |
| 788.0 | 98.836 |
| 787.0 | 98.752 |
| 786.0 | 99.98 |
| 785.0 | 99.22 |
| 784.0 | 98.868 |
| 783.0 | 97.869 |
| 782.0 | 99.294 |
| 781.0 | 99.296 |
| 780.0 | 99.212 |
| 779.0 | 99.539 |
| 778.0 | 99.024 |
| 777.0 | 99.097 |
| 776.0 | 98.671 |
| 775.0 | 98.694 |
| 774.0 | 98.758 |
| 773.0 | 99.557 |
| 772.0 | 99.196 |
| 771.0 | 99.587 |
| 770.0 | 98.486 |
| 769.0 | 98.332 |
| 768.0 | 99.065 |
| 767.0 | 98.865 |
| 766.0 | 99.203 |
| 765.0 | 99.739 |
| 764.0 | 98.888 |
| 763.0 | 98.76 |
| 762.0 | 99.295 |
| 761.0 | 99.722 |
| 760.0 | 99.02 |
| 759.0 | 98.285 |
| 758.0 | 98.978 |
| 757.0 | 99.26 |
| 756.0 | 98.919 |
| 755.0 | 99.229 |
| 754.0 | 98.97 |
| 753.0 | 99.265 |
| 752.0 | 99.538 |
| 751.0 | 98.931 |
| 750.0 | 98.917 |
| 749.0 | 99.029 |
| 748.0 | 99.259 |
| 747.0 | 99.324 |
| 746.0 | 98.892 |
| 745.0 | 98.705 |
| 744.0 | 98.723 |
| 743.0 | 99.63 |
| 742.0 | 98.978 |
| 741.0 | 98.621 |
| 740.0 | 99.286 |
| 739.0 | 99.297 |
| 738.0 | 98.792 |
| 737.0 | 98.604 |
| 736.0 | 98.282 |
| 735.0 | 98.571 |
| 734.0 | 98.573 |
| 733.0 | 99.196 |
| 732.0 | 99.37 |
| 731.0 | 99.134 |
| 730.0 | 98.645 |
| 729.0 | 98.787 |
| 728.0 | 98.304 |
| 727.0 | 98.356 |
| 726.0 | 98.827 |
| 725.0 | 99.641 |
| 724.0 | 98.931 |
| 723.0 | 98.767 |
| 722.0 | 99.307 |
| 721.0 | 99.297 |
| 720.0 | 99.472 |
| 719.0 | 98.873 |
| 718.0 | 98.788 |
| 717.0 | 99.293 |
| 716.0 | 98.755 |
| 715.0 | 98.836 |
| 714.0 | 99.394 |
| 713.0 | 98.919 |
| 712.0 | 98.544 |
| 711.0 | 98.886 |
| 710.0 | 98.788 |
| 709.0 | 98.76 |
| 708.0 | 98.668 |
| 707.0 | 98.509 |
| 706.0 | 98.302 |
| 705.0 | 98.52 |
| 704.0 | 98.833 |
| 703.0 | 98.779 |
| 702.0 | 98.473 |
| 701.0 | 98.258 |
| 700.0 | 98.602 |
| 699.0 | 99.046 |
| 698.0 | 99.235 |
| 697.0 | 98.713 |
| 696.0 | 98.372 |
| 695.0 | 98.48 |
| 694.0 | 98.61 |
| 693.0 | 98.715 |
| 692.0 | 98.659 |
| 691.0 | 98.868 |
| 690.0 | 99.099 |
| 689.0 | 99.066 |
| 688.0 | 98.776 |
| 687.0 | 98.895 |
| 686.0 | 98.554 |
| 685.0 | 98.554 |
| 684.0 | 99.018 |
| 683.0 | 99.269 |
| 682.0 | 99.255 |
| 681.0 | 98.541 |
| 680.0 | 98.032 |
| 679.0 | 98.742 |
| 678.0 | 99.04 |
| 677.0 | 98.829 |
| 676.0 | 98.726 |
| 675.0 | 98.838 |
| 674.0 | 98.647 |
| 673.0 | 98.296 |
| 672.0 | 97.46 |
| 671.0 | 97.255 |
| 670.0 | 75.321 |
| 669.0 | 27.267 |
| 668.0 | 1.678 |
| 667.0 | 0.054 |
| 666.0 | 0.004 |
| 665.0 | 0.001 |
| 664.0 | 0.001 |
| 663.0 | 0 |
| 662.0 | 0 |
| 661.0 | 0 |
| 660.0 | 0 |
| 659.0 | 0 |
| 658.0 | 0 |
| 657.0 | 0 |
| 656.0 | 0 |
| 655.0 | 0 |
| 654.0 | 0 |
| 653.0 | 0 |
| 652.0 | 0.001 |
| 651.0 | 0.001 |
| 650.0 | 0.001 |
| 649.0 | 0.008 |
| 648.0 | 0.142 |
| 647.0 | 9.262 |
| 646.0 | 48.73 |
| 645.0 | 83.044 |
| 644.0 | 94.784 |
| 643.0 | 97.538 |
| 642.0 | 97.731 |
| 641.0 | 97.787 |
| 640.0 | 97.982 |
| 639.0 | 97.651 |
| 638.0 | 98.428 |
| 637.0 | 99.578 |
| 636.0 | 99.1 |
| 635.0 | 98.626 |
| 634.0 | 97.982 |
| 633.0 | 98.351 |
| 632.0 | 99 |
| 631.0 | 99.132 |
| 630.0 | 98.9 |
| 629.0 | 98.92 |
| 628.0 | 98.478 |
| 627.0 | 98.035 |
| 626.0 | 98.571 |
| 625.0 | 99.174 |
| 624.0 | 99.014 |
| 623.0 | 98.633 |
| 622.0 | 97.875 |
| 621.0 | 98.559 |
| 620.0 | 99.081 |
| 619.0 | 99.367 |
| 618.0 | 98.914 |
| 617.0 | 98.909 |
| 616.0 | 98.722 |
| 615.0 | 98.818 |
| 614.0 | 99.572 |
| 613.0 | 99.774 |
| 612.0 | 99.374 |
| 611.0 | 98.462 |
| 610.0 | 98.153 |
| 609.0 | 98.089 |
| 608.0 | 99.103 |
| 607.0 | 99.572 |
| 606.0 | 99.057 |
| 605.0 | 98.585 |
| 604.0 | 98.766 |
| 603.0 | 98.003 |
| 602.0 | 99.011 |
| 601.0 | 99.247 |
| 600.0 | 98.687 |
| 599.0 | 98.757 |
| 598.0 | 98.406 |
| 597.0 | 98.338 |
| 596.0 | 99.026 |
| 595.0 | 99.326 |
| 594.0 | 98.791 |
| 593.0 | 98.63 |
| 592.0 | 98.615 |
| 591.0 | 97.97 |
| 590.0 | 99.13 |
| 589.0 | 99.373 |
| 588.0 | 98.701 |
| 587.0 | 98.356 |
| 586.0 | 98.669 |
| 585.0 | 98.284 |
| 584.0 | 99.391 |
| 583.0 | 99.718 |
| 582.0 | 98.381 |
| 581.0 | 98.347 |
| 580.0 | 98.296 |
| 579.0 | 97.952 |
| 578.0 | 99.066 |
| 577.0 | 99.218 |
| 576.0 | 98.301 |
| 575.0 | 98.979 |
| 574.0 | 98.485 |
| 573.0 | 97.855 |
| 572.0 | 98.67 |
| 571.0 | 99.185 |
| 570.0 | 98.441 |
| 569.0 | 98.33 |
| 568.0 | 98.337 |
| 567.0 | 98.722 |
| 566.0 | 99.002 |
| 565.0 | 99.325 |
| 564.0 | 98.321 |
| 563.0 | 98.335 |
| 562.0 | 98.278 |
| 561.0 | 98.796 |
| 560.0 | 98.159 |
| 559.0 | 98.974 |
| 558.0 | 98.769 |
| 557.0 | 98.331 |
| 556.0 | 98.324 |
| 555.0 | 98.616 |
| 554.0 | 97.938 |
| 553.0 | 97.779 |
| 552.0 | 98.651 |
| 551.0 | 98.298 |
| 550.0 | 98.19 |
| 549.0 | 98.728 |
| 548.0 | 98.341 |
| 547.0 | 98.685 |
| 546.0 | 98.675 |
| 545.0 | 98.366 |
| 544.0 | 98.658 |
| 543.0 | 98.676 |
| 542.0 | 97.948 |
| 541.0 | 98.39 |
| 540.0 | 98.899 |
| 539.0 | 98.417 |
| 538.0 | 98.597 |
| 537.0 | 98.395 |
| 536.0 | 98.056 |
| 535.0 | 98.225 |
| 534.0 | 98.391 |
| 533.0 | 98.025 |
| 532.0 | 98.271 |
| 531.0 | 98.346 |
| 530.0 | 97.686 |
| 529.0 | 98.206 |
| 528.0 | 98.614 |
| 527.0 | 98.34 |
| 526.0 | 98.652 |
| 525.0 | 98.478 |
| 524.0 | 97.641 |
| 523.0 | 98.366 |
| 522.0 | 98.183 |
| 521.0 | 98.101 |
| 520.0 | 98.065 |
| 519.0 | 98.237 |
| 518.0 | 97.648 |
| 517.0 | 98.14 |
| 516.0 | 98.138 |
| 515.0 | 97.903 |
| 514.0 | 98.085 |
| 513.0 | 98.355 |
| 512.0 | 98.017 |
| 511.0 | 98.123 |
| 510.0 | 98.536 |
| 509.0 | 97.587 |
| 508.0 | 98.229 |
| 507.0 | 98.275 |
| 506.0 | 97.769 |
| 505.0 | 98.552 |
| 504.0 | 98.244 |
| 503.0 | 98.259 |
| 502.0 | 98.362 |
| 501.0 | 97.93 |
| 500.0 | 97.899 |
| 499.0 | 98.318 |
| 498.0 | 98.276 |
| 497.0 | 98.176 |
| 496.0 | 98.108 |
| 495.0 | 98.015 |
| 494.0 | 97.998 |
| 493.0 | 98.031 |
| 492.0 | 97.976 |
| 491.0 | 97.957 |
| 490.0 | 97.986 |
| 489.0 | 97.921 |
| 488.0 | 97.831 |
| 487.0 | 97.855 |
| 486.0 | 97.882 |
| 485.0 | 97.928 |
| 484.0 | 98.04 |
| 483.0 | 98.1 |
| 482.0 | 98.104 |
| 481.0 | 98.103 |
| 480.0 | 98.078 |
| 479.0 | 98.09 |
| 478.0 | 98.117 |
| 477.0 | 98.049 |
| 476.0 | 97.923 |
| 475.0 | 97.713 |
| 474.0 | 97.523 |
| 473.0 | 97.545 |
| 472.0 | 97.394 |
| 471.0 | 94.34 |
| 470.0 | 83.205 |
| 469.0 | 63.493 |
| 468.0 | 42.434 |
| 467.0 | 27.044 |
| 466.0 | 18.133 |
| 465.0 | 12.854 |
| 464.0 | 9.14 |
| 463.0 | 7.069 |
| 462.0 | 7.132 |
| 461.0 | 7.629 |
| 460.0 | 6.469 |
| 459.0 | 4.643 |
| 458.0 | 3.688 |
| 457.0 | 2.864 |
| 456.0 | 1.777 |
| 455.0 | 1.012 |
| 454.0 | 0.517 |
| 453.0 | 0.154 |
| 452.0 | 0.012 |
| 451.0 | 0.004 |
| 450.0 | 0.005 |
| 449.0 | 0.004 |
| 448.0 | 0.001 |
| 447.0 | 0.004 |
| 446.0 | 0.005 |
| 445.0 | 0.005 |
| 444.0 | 0.005 |
| 443.0 | 0.004 |
| 442.0 | 0.002 |
| 441.0 | 0.005 |
| 440.0 | 0.007 |
| 439.0 | 0.004 |
| 438.0 | 0.005 |
| 437.0 | 0.004 |
| 436.0 | 0.001 |
| 435.0 | 0.004 |
| 434.0 | 0.007 |
| 433.0 | 0.004 |
| 432.0 | 0.004 |
| 431.0 | 0.003 |
| 430.0 | 0.002 |
| 429.0 | 0.003 |
| 428.0 | 0.007 |
| 427.0 | 0.005 |
| 426.0 | 0.005 |
| 425.0 | 0.004 |
| 424.0 | 0.002 |
| 423.0 | 0.005 |
| 422.0 | 0.006 |
| 421.0 | 0.004 |
| 420.0 | 0.005 |
| 419.0 | 0.003 |
| 418.0 | 0.002 |
| 417.0 | 0.004 |
| 416.0 | 0.007 |
| 415.0 | 0.007 |
| 414.0 | 0.007 |
| 413.0 | 0.003 |
| 412.0 | 0.002 |
| 411.0 | 0.006 |
| 410.0 | 0.007 |
| 409.0 | 0.003 |
| 408.0 | 0.005 |
| 407.0 | 0.003 |
| 406.0 | 0.003 |
| 405.0 | 0.006 |
| 404.0 | 0.007 |
| 403.0 | 0.007 |
| 402.0 | 0.007 |
| 401.0 | 0.002 |
| 400.0 | 0.002 |
| 399.0 | 0.004 |
| 398.0 | 0.006 |
| 397.0 | 0.006 |
| 396.0 | 0.006 |
| 395.0 | 0.003 |
| 394.0 | 0.002 |
| 393.0 | 0.005 |
| 392.0 | 0.007 |
| 391.0 | 0.003 |
| 390.0 | 0.005 |
| 389.0 | 0.003 |
| 388.0 | 0.002 |
| 387.0 | 0.005 |
| 386.0 | 0.006 |
| 385.0 | 0.006 |
| 384.0 | 0.005 |
| 383.0 | 0.003 |
| 382.0 | 0.003 |
| 381.0 | 0.006 |
| 380.0 | 0.005 |
| 379.0 | 0.005 |
| 378.0 | 0.006 |
| 377.0 | 0.004 |
| 376.0 | 0.004 |
| 375.0 | 0.005 |
| 374.0 | 0.005 |
| 373.0 | 0.001 |
| 372.0 | 0 |
| 371.0 | 0.003 |
| 370.0 | 0.006 |
| 369.0 | 0.006 |
| 368.0 | 0.005 |
| 367.0 | 0.002 |
| 366.0 | 0 |
| 365.0 | 0.004 |
| 364.0 | 0.005 |
| 363.0 | 0.005 |
| 362.0 | 0.005 |
| 361.0 | 0.002 |
| 360.0 | 0.001 |
| 359.0 | 0.005 |
| 358.0 | 0.007 |
| 357.0 | 0.005 |
| 356.0 | 0.005 |
| 355.0 | 0.002 |
| 354.0 | 0 |
| 353.0 | 0.005 |
| 352.0 | 0.006 |
| 351.0 | 0.003 |
| 350.0 | 0.004 |
| 349.0 | 0.002 |
| 348.0 | 0.001 |
| 347.0 | 0.004 |
| 346.0 | 0.006 |
| 345.0 | 0.004 |
| 344.0 | 0.004 |
| 343.0 | 0.002 |
| 342.0 | 0.001 |
| 341.0 | 0.006 |
| 340.0 | 0.006 |
| 339.0 | 0.007 |
| 338.0 | 0.004 |
| 337.0 | 0.002 |
| 336.0 | 0.001 |
| 335.0 | 0.006 |
| 334.0 | 0.006 |
| 333.0 | 0.008 |
| 332.0 | 0.005 |
| 331.0 | 0.002 |
| 330.0 | 0.002 |
| 329.0 | 0.006 |
| 328.0 | 0.007 |
| 327.0 | 0.007 |
| 326.0 | 0.005 |
| 325.0 | 0.003 |
| 324.0 | 0.002 |
| 323.0 | 0.006 |
| 322.0 | 0.007 |
| 321.0 | 0.006 |
| 320.0 | 0.006 |
| 319.0 | 0.002 |
| 318.0 | 0.005 |
| 317.0 | 0.005 |
| 316.0 | 0.005 |
| 315.0 | 0.005 |
| 314.0 | 0.005 |
| 313.0 | 0.001 |
| 312.0 | 0.002 |
| 311.0 | 0.005 |
| 310.0 | 0.006 |
| 309.0 | 0.005 |
| 308.0 | 0.006 |
| 307.0 | 0.004 |
| 306.0 | 0.001 |
| 305.0 | 0.006 |
| 304.0 | 0.006 |
| 303.0 | 0.006 |
| 302.0 | 0.004 |
| 301.0 | 0.001 |
| 300.0 | 0.001 |
| 299.0 | 0.005 |
| 298.0 | 0.006 |
| 297.0 | 0.003 |
| 296.0 | 0.005 |
| 295.0 | 0.003 |
| 294.0 | 0 |
| 293.0 | 0.006 |
| 292.0 | 0.004 |
| 291.0 | 0.002 |
| 290.0 | 0.005 |
| 289.0 | 0.002 |
| 288.0 | 0 |
| 287.0 | 0.006 |
| 286.0 | 0.004 |
| 285.0 | 0.006 |
| 284.0 | 0.003 |
| 283.0 | 0.003 |
| 282.0 | 0 |
| 281.0 | 0.005 |
| 280.0 | 0.006 |
| 279.0 | 0.003 |
| 278.0 | 0.004 |
| 277.0 | 0.003 |
| 276.0 | 0 |
| 275.0 | 0.007 |
| 274.0 | 0.005 |
| 273.0 | 0.004 |
| 272.0 | 0.006 |
| 271.0 | 0.001 |
| 270.0 | 0.001 |
| 269.0 | 0.005 |
| 268.0 | 0.006 |
| 267.0 | 0.004 |
| 266.0 | 0.002 |
| 265.0 | 0.001 |
| 264.0 | 0.001 |
| 263.0 | 0.005 |
| 262.0 | 0.007 |
| 261.0 | 0.002 |
| 260.0 | 0.006 |
| 259.0 | 0.001 |
| 258.0 | 0.002 |
| 257.0 | 0.006 |
| 256.0 | 0.007 |
| 255.0 | 0.002 |
| 254.0 | 0.006 |
| 253.0 | 0.001 |
| 252.0 | 0.002 |
| 251.0 | 0.005 |
| 250.0 | 0.007 |
| 249.0 | 0.001 |
| 248.0 | 0.006 |
| 247.0 | 0.001 |
| 246.0 | 0.002 |
| 245.0 | 0.005 |
| 244.0 | 0.007 |
| 243.0 | 0.003 |
| 242.0 | 0.007 |
| 241.0 | 0.003 |
| 240.0 | 0.003 |
| 239.0 | 0.005 |
| 238.0 | 0.007 |
| 237.0 | 0.004 |
| 236.0 | 0.007 |
| 235.0 | 0 |
| 234.0 | 0.003 |
| 233.0 | 0.006 |
| 232.0 | 0.007 |
| 231.0 | 0.006 |
| 230.0 | 0.007 |
| 229.0 | 0.001 |
| 228.0 | 0.003 |
| 227.0 | 0.006 |
| 226.0 | 0.007 |
| 225.0 | 0.007 |
| 224.0 | 0.006 |
| 223.0 | 0.002 |
| 222.0 | 0.003 |
| 221.0 | 0.008 |
| 220.0 | 0.009 |
| 219.0 | 0.004 |
| 218.0 | 0.006 |
| 217.0 | 0.002 |
| 216.0 | 0.002 |
| 215.0 | 0.008 |
| 214.0 | 0.007 |
| 213.0 | 0.007 |
| 212.0 | 0.006 |
| 211.0 | 0.003 |
| 210.0 | 0.004 |
| 209.0 | 0.008 |
| 208.0 | 0.008 |
| 207.0 | 0.005 |
| 206.0 | 0.007 |
| 205.0 | 0.004 |
| 204.0 | 0.005 |
| 203.0 | 0.011 |
| 202.0 | 0.011 |
| 201.0 | 0.009 |